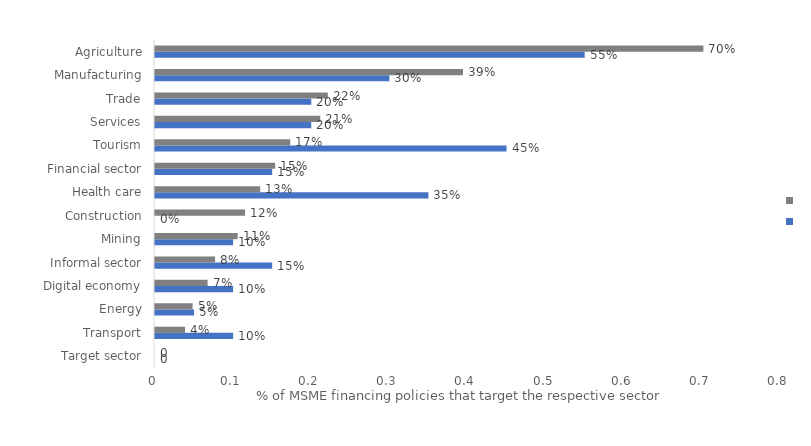
| Category | Series 0 | Series 1 |
|---|---|---|
| Target sector | 0 | 0 |
| Transport | 0.1 | 0.038 |
| Energy | 0.05 | 0.048 |
| Digital economy | 0.1 | 0.067 |
| Informal sector | 0.15 | 0.077 |
| Mining | 0.1 | 0.106 |
| Construction | 0 | 0.115 |
| Health care | 0.35 | 0.135 |
| Financial sector | 0.15 | 0.154 |
| Tourism | 0.45 | 0.173 |
| Services | 0.2 | 0.212 |
| Trade | 0.2 | 0.221 |
| Manufacturing | 0.3 | 0.394 |
| Agriculture | 0.55 | 0.702 |